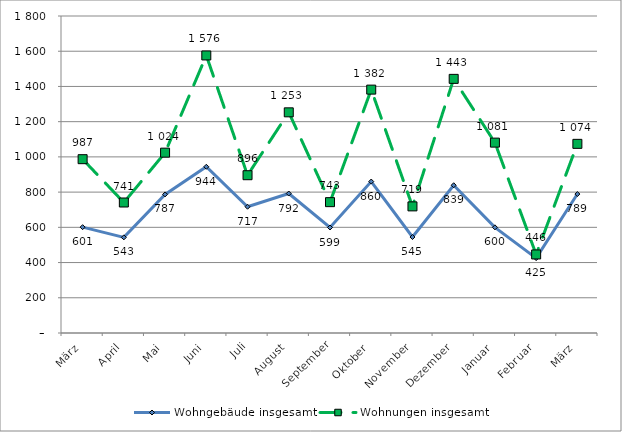
| Category | Wohngebäude insgesamt | Wohnungen insgesamt |
|---|---|---|
| März | 601 | 987 |
| April | 543 | 741 |
| Mai | 787 | 1024 |
| Juni | 944 | 1576 |
| Juli | 717 | 896 |
| August | 792 | 1253 |
| September | 599 | 743 |
| Oktober | 860 | 1382 |
| November | 545 | 719 |
| Dezember | 839 | 1443 |
| Januar | 600 | 1081 |
| Februar | 425 | 446 |
| März | 789 | 1074 |